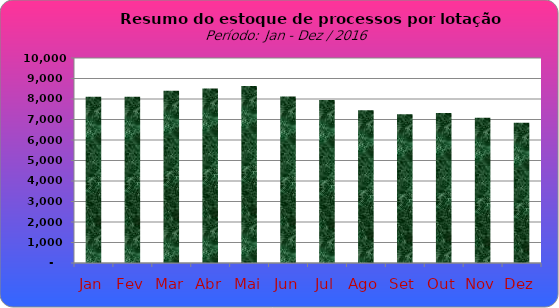
| Category | Series 0 |
|---|---|
| Jan | 8111 |
| Fev | 8114 |
| Mar | 8403 |
| Abr | 8512 |
| Mai | 8633 |
| Jun | 8120 |
| Jul | 7954 |
| Ago | 7447 |
| Set | 7258 |
| Out | 7313 |
| Nov | 7091 |
| Dez | 6842 |